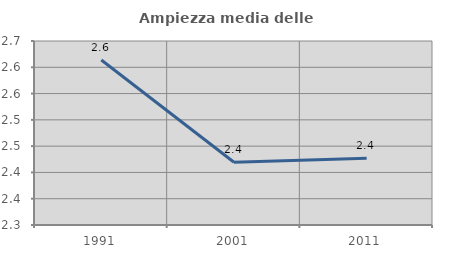
| Category | Ampiezza media delle famiglie |
|---|---|
| 1991.0 | 2.614 |
| 2001.0 | 2.419 |
| 2011.0 | 2.427 |